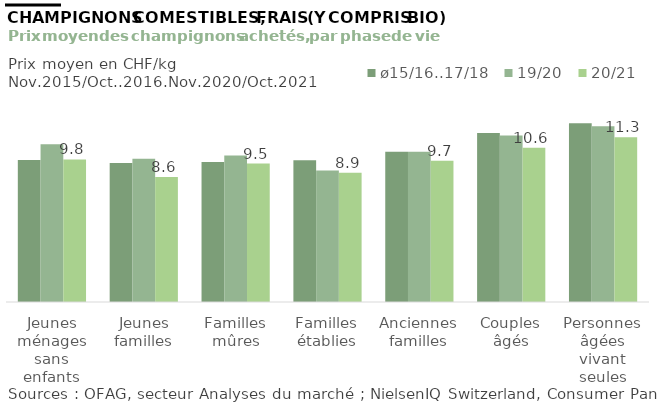
| Category | ø15/16..17/18 | 19/20 | 20/21 |
|---|---|---|---|
| Jeunes ménages sans enfants | 9.748 | 10.828 | 9.784 |
| Jeunes familles | 9.532 | 9.824 | 8.587 |
| Familles mûres | 9.609 | 10.051 | 9.503 |
| Familles établies | 9.721 | 9.029 | 8.871 |
| Anciennes familles | 10.31 | 10.315 | 9.697 |
| Couples âgés | 11.598 | 11.424 | 10.594 |
| Personnes âgées vivant seules | 12.26 | 12.061 | 11.309 |